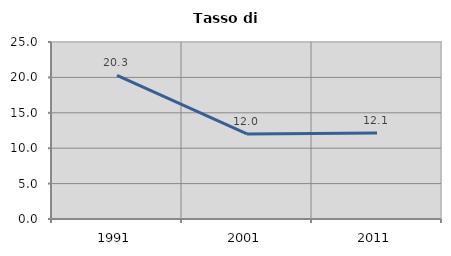
| Category | Tasso di disoccupazione   |
|---|---|
| 1991.0 | 20.282 |
| 2001.0 | 12.012 |
| 2011.0 | 12.132 |